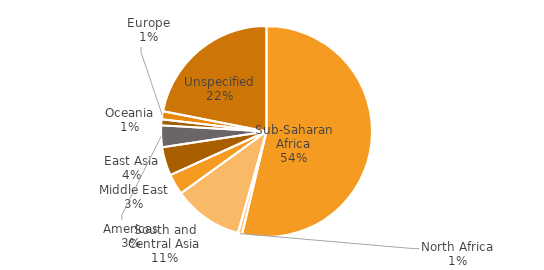
| Category | Series 0 |
|---|---|
| Sub-Saharan Africa | 11914.604 |
| North Africa | 143.31 |
| South and Central Asia | 2371.224 |
| Middle East | 704.61 |
| East Asia | 971.059 |
| Americas | 736.085 |
| Oceania | 204.958 |
| Europe | 274.546 |
| Unspecified | 4860.631 |